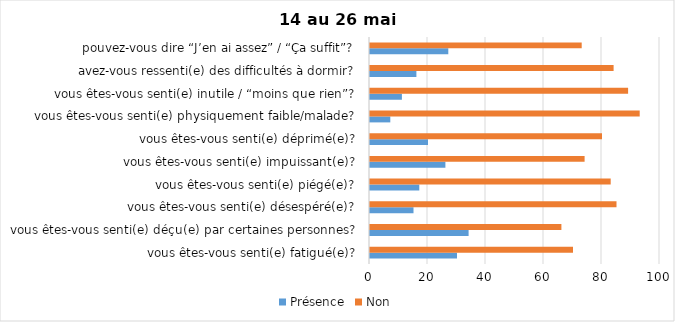
| Category | Présence | Non |
|---|---|---|
| vous êtes-vous senti(e) fatigué(e)? | 30 | 70 |
| vous êtes-vous senti(e) déçu(e) par certaines personnes? | 34 | 66 |
| vous êtes-vous senti(e) désespéré(e)? | 15 | 85 |
| vous êtes-vous senti(e) piégé(e)? | 17 | 83 |
| vous êtes-vous senti(e) impuissant(e)? | 26 | 74 |
| vous êtes-vous senti(e) déprimé(e)? | 20 | 80 |
| vous êtes-vous senti(e) physiquement faible/malade? | 7 | 93 |
| vous êtes-vous senti(e) inutile / “moins que rien”? | 11 | 89 |
| avez-vous ressenti(e) des difficultés à dormir? | 16 | 84 |
| pouvez-vous dire “J’en ai assez” / “Ça suffit”? | 27 | 73 |